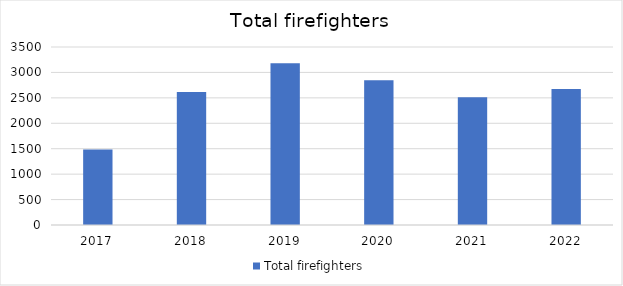
| Category | Total firefighters |
|---|---|
| 2017.0 | 1484 |
| 2018.0 | 2614 |
| 2019.0 | 3181 |
| 2020.0 | 2845 |
| 2021.0 | 2510 |
| 2022.0 | 2672 |